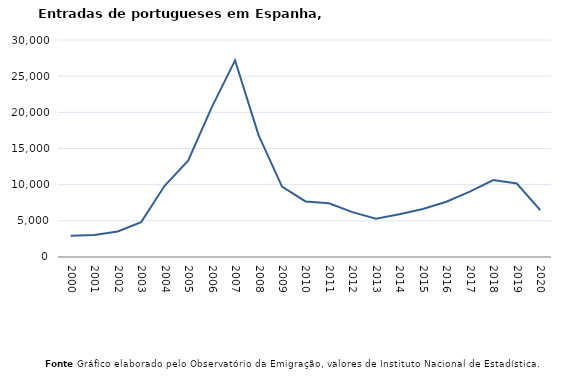
| Category | Entradas |
|---|---|
| 2000.0 | 2955 |
| 2001.0 | 3057 |
| 2002.0 | 3538 |
| 2003.0 | 4825 |
| 2004.0 | 9851 |
| 2005.0 | 13327 |
| 2006.0 | 20658 |
| 2007.0 | 27178 |
| 2008.0 | 16857 |
| 2009.0 | 9739 |
| 2010.0 | 7678 |
| 2011.0 | 7424 |
| 2012.0 | 6201 |
| 2013.0 | 5302 |
| 2014.0 | 5923 |
| 2015.0 | 6638 |
| 2016.0 | 7646 |
| 2017.0 | 9038 |
| 2018.0 | 10636 |
| 2019.0 | 10155 |
| 2020.0 | 6471 |